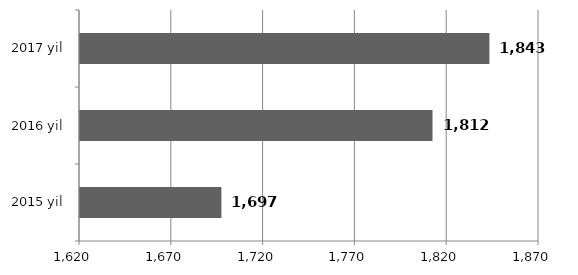
| Category | Series 0 |
|---|---|
| 2015 yil | 1697 |
| 2016 yil | 1812 |
| 2017 yil | 1843 |